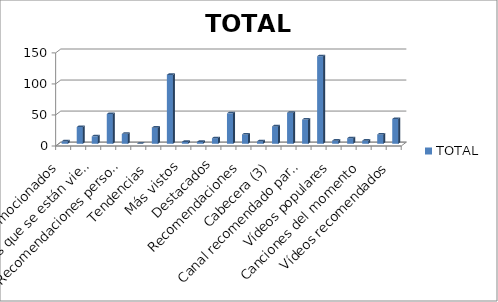
| Category | TOTAL |
|---|---|
| Vídeos promocionados | 4 |
| Vídeos destacados | 27 |
| Vídeos que se están viendo ahora | 12 |
| Más Populares  (1) | 48 |
| Recomendaciones personalizadas  | 16 |
| Vídeos que se están viendo ahora | 0 |
| Tendencias  | 26 |
| Diversas categorías (2) | 111 |
| Más vistos | 3 |
| Superfavoritos | 3 |
| Destacados | 9 |
| De Youtube | 49 |
| Recomendaciones | 15 |
| Vídeos del día | 4 |
| Cabecera (3) | 28 |
| Populares en Youtube | 50 |
| Canal recomendado para ti | 39 |
| Canal recomendado | 141 |
| Vídeos populares | 5 |
| Vídeos del momento | 9 |
| Canciones del momento | 5 |
| Tema | 15 |
| Vídeos recomendados | 40 |